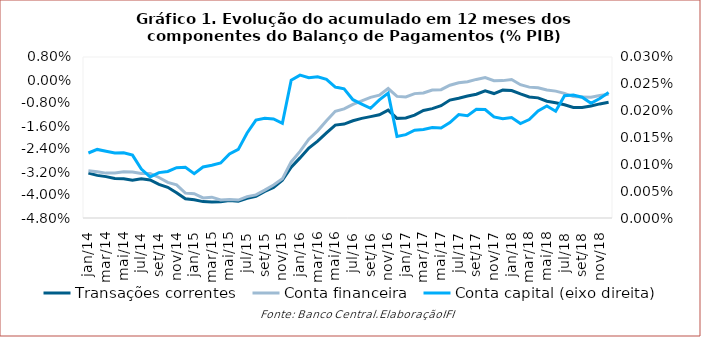
| Category | Transações correntes | Conta financeira |
|---|---|---|
| jan/14 | -0.032 | -0.032 |
| fev/14 | -0.033 | -0.032 |
| mar/14 | -0.034 | -0.032 |
| abr/14 | -0.034 | -0.032 |
| mai/14 | -0.034 | -0.032 |
| jun/14 | -0.035 | -0.032 |
| jul/14 | -0.034 | -0.033 |
| ago/14 | -0.035 | -0.032 |
| set/14 | -0.036 | -0.034 |
| out/14 | -0.037 | -0.036 |
| nov/14 | -0.039 | -0.036 |
| dez/14 | -0.041 | -0.039 |
| jan/15 | -0.042 | -0.04 |
| fev/15 | -0.042 | -0.041 |
| mar/15 | -0.042 | -0.041 |
| abr/15 | -0.042 | -0.042 |
| mai/15 | -0.042 | -0.042 |
| jun/15 | -0.042 | -0.042 |
| jul/15 | -0.041 | -0.041 |
| ago/15 | -0.04 | -0.04 |
| set/15 | -0.039 | -0.038 |
| out/15 | -0.037 | -0.037 |
| nov/15 | -0.035 | -0.034 |
| dez/15 | -0.03 | -0.028 |
| jan/16 | -0.027 | -0.025 |
| fev/16 | -0.024 | -0.021 |
| mar/16 | -0.021 | -0.018 |
| abr/16 | -0.018 | -0.014 |
| mai/16 | -0.016 | -0.011 |
| jun/16 | -0.015 | -0.01 |
| jul/16 | -0.014 | -0.008 |
| ago/16 | -0.013 | -0.007 |
| set/16 | -0.013 | -0.006 |
| out/16 | -0.012 | -0.005 |
| nov/16 | -0.01 | -0.003 |
| dez/16 | -0.013 | -0.006 |
| jan/17 | -0.013 | -0.006 |
| fev/17 | -0.012 | -0.005 |
| mar/17 | -0.011 | -0.005 |
| abr/17 | -0.01 | -0.003 |
| mai/17 | -0.009 | -0.003 |
| jun/17 | -0.007 | -0.002 |
| jul/17 | -0.006 | -0.001 |
| ago/17 | -0.006 | -0.001 |
| set/17 | -0.005 | 0 |
| out/17 | -0.004 | 0.001 |
| nov/17 | -0.005 | 0 |
| dez/17 | -0.004 | 0 |
| jan/18 | -0.004 | 0 |
| fev/18 | -0.005 | -0.002 |
| mar/18 | -0.006 | -0.002 |
| abr/18 | -0.006 | -0.003 |
| mai/18 | -0.007 | -0.003 |
| jun/18 | -0.008 | -0.004 |
| jul/18 | -0.009 | -0.005 |
| ago/18 | -0.01 | -0.006 |
| set/18 | -0.01 | -0.006 |
| out/18 | -0.009 | -0.006 |
| nov/18 | -0.008 | -0.005 |
| dez/18 | -0.008 | -0.005 |